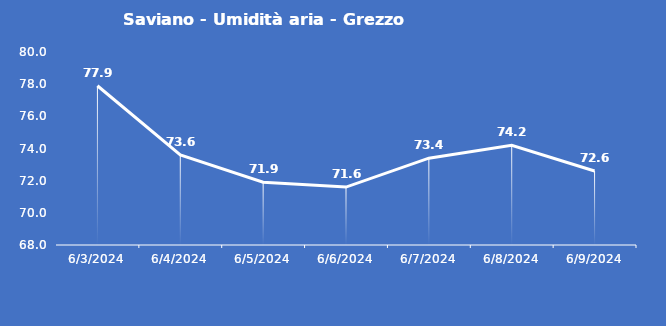
| Category | Saviano - Umidità aria - Grezzo (%) |
|---|---|
| 6/3/24 | 77.9 |
| 6/4/24 | 73.6 |
| 6/5/24 | 71.9 |
| 6/6/24 | 71.6 |
| 6/7/24 | 73.4 |
| 6/8/24 | 74.2 |
| 6/9/24 | 72.6 |